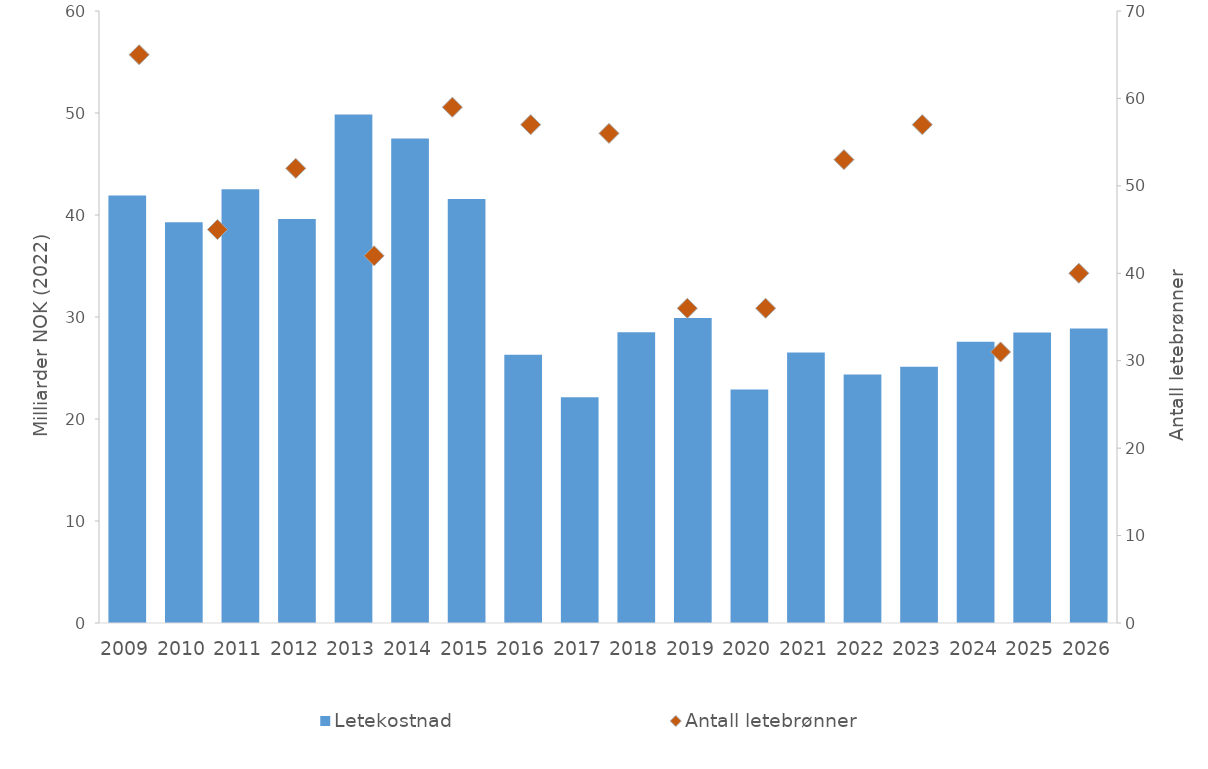
| Category | Letekostnad  |
|---|---|
| 2009.0 | 41.914 |
| 2010.0 | 39.28 |
| 2011.0 | 42.52 |
| 2012.0 | 39.618 |
| 2013.0 | 49.864 |
| 2014.0 | 47.511 |
| 2015.0 | 41.558 |
| 2016.0 | 26.291 |
| 2017.0 | 22.128 |
| 2018.0 | 28.512 |
| 2019.0 | 29.895 |
| 2020.0 | 22.904 |
| 2021.0 | 26.526 |
| 2022.0 | 24.356 |
| 2023.0 | 25.122 |
| 2024.0 | 27.576 |
| 2025.0 | 28.481 |
| 2026.0 | 28.885 |